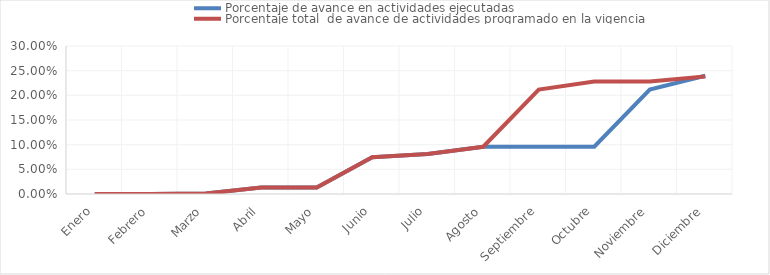
| Category | Porcentaje de avance en actividades ejecutadas | Porcentaje total  de avance de actividades programado en la vigencia |
|---|---|---|
| 0 | 0 | 0 |
| 1 | 0 | 0 |
| 2 | 0.001 | 0.001 |
| 3 | 0.013 | 0.013 |
| 4 | 0.013 | 0.013 |
| 5 | 0.075 | 0.075 |
| 6 | 0.081 | 0.081 |
| 7 | 0.096 | 0.096 |
| 8 | 0.096 | 0.212 |
| 9 | 0.096 | 0.228 |
| 10 | 0.212 | 0.228 |
| 11 | 0.24 | 0.238 |